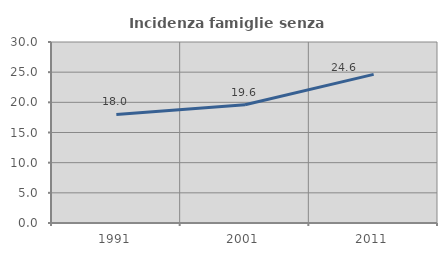
| Category | Incidenza famiglie senza nuclei |
|---|---|
| 1991.0 | 17.987 |
| 2001.0 | 19.599 |
| 2011.0 | 24.631 |